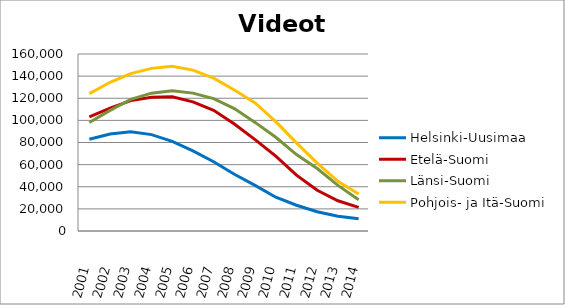
| Category | Helsinki-Uusimaa | Etelä-Suomi | Länsi-Suomi | Pohjois- ja Itä-Suomi |
|---|---|---|---|---|
| 2001.0 | 82951 | 103246 | 98090 | 124239 |
| 2002.0 | 87641 | 110998 | 109015 | 134450 |
| 2003.0 | 89610 | 117846 | 118965 | 142278 |
| 2004.0 | 87131 | 120944 | 124591 | 147008 |
| 2005.0 | 81064 | 121332 | 126858 | 148851 |
| 2006.0 | 72423 | 116786 | 124648 | 145442 |
| 2007.0 | 62622 | 109046 | 119678 | 138212 |
| 2008.0 | 51343 | 96720 | 110696 | 127519 |
| 2009.0 | 41242 | 82597 | 98175 | 115745 |
| 2010.0 | 30500 | 67773 | 84735 | 98863 |
| 2011.0 | 23296 | 50488 | 69089 | 79648 |
| 2012.0 | 17385 | 36857 | 56493 | 61339 |
| 2013.0 | 13376 | 27298 | 41253 | 44906 |
| 2014.0 | 11019 | 21311 | 28307 | 33478 |